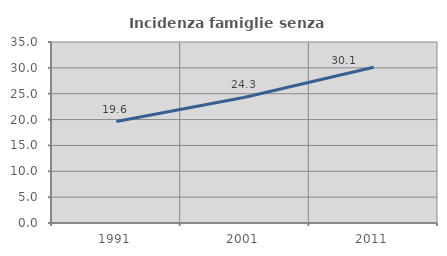
| Category | Incidenza famiglie senza nuclei |
|---|---|
| 1991.0 | 19.621 |
| 2001.0 | 24.326 |
| 2011.0 | 30.117 |